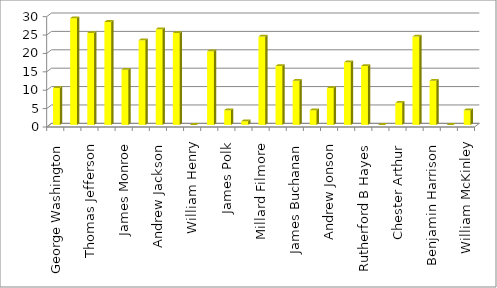
| Category | Series 0 |
|---|---|
| George Washington | 10 |
| John Adams | 29 |
| Thomas Jefferson | 25 |
| James Madison | 28 |
| James Monroe | 15 |
| John Quincy Adams | 23 |
| Andrew Jackson | 26 |
| Martin Van Buren | 25 |
| William Henry Harrison | 0 |
| John Tyler | 20 |
| James Polk | 4 |
| Zachary Taylor | 1 |
| Millard Filmore | 24 |
| Franklin Pierce | 16 |
| James Buchanan | 12 |
| Abraham Lincoln | 4 |
| Andrew Jonson | 10 |
| Ulysses S Grant | 17 |
| Rutherford B Hayes | 16 |
| James Garfield | 0 |
| Chester Arthur | 6 |
| Grover Cleveland | 24 |
| Benjamin Harrison | 12 |
| Grover Cleveland | 0 |
| William McKinley | 4 |